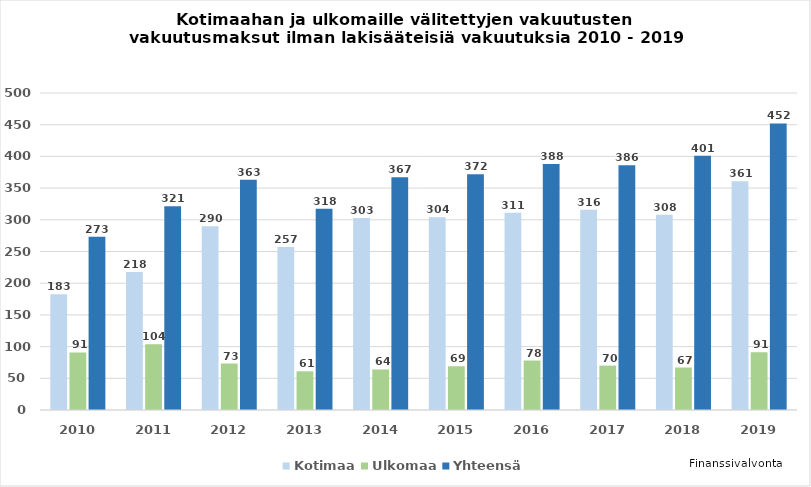
| Category | Kotimaa | Ulkomaa | Yhteensä  |
|---|---|---|---|
| 2010.0 | 182.562 | 90.729 | 273.291 |
| 2011.0 | 217.55 | 103.894 | 321.444 |
| 2012.0 | 289.922 | 73.321 | 363.243 |
| 2013.0 | 257 | 61 | 317.523 |
| 2014.0 | 303 | 64 | 367 |
| 2015.0 | 304 | 69 | 372 |
| 2016.0 | 311 | 78 | 388 |
| 2017.0 | 316 | 70 | 386 |
| 2018.0 | 308 | 67 | 401 |
| 2019.0 | 361 | 91 | 452 |